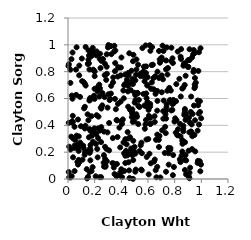
| Category | Series 0 |
|---|---|
| 0.9111496311391557 | 0.047 |
| 0.4300386188368164 | 0.173 |
| 0.11681385047252048 | 0.232 |
| 0.7985105165914542 | 0.428 |
| 0.7381791122740708 | 0.534 |
| 0.2700319630789535 | 0.093 |
| 0.3221652277435572 | 0.637 |
| 0.9387445722189655 | 0.929 |
| 0.1267107533791488 | 0.538 |
| 0.4287532225961268 | 0.779 |
| 0.6065511356872197 | 0.471 |
| 0.8351346793216523 | 0.747 |
| 0.5862582522591401 | 0.839 |
| 0.44732217881595854 | 0.35 |
| 0.4488559231616693 | 0.695 |
| 0.43003705787691354 | 0.297 |
| 0.7948076341762961 | 0.57 |
| 0.19928670790254213 | 0.672 |
| 0.8404600769013258 | 0.41 |
| 0.5054611740116359 | 0.586 |
| 0.3084729279485909 | 0.418 |
| 0.7179206851709915 | 0.585 |
| 0.5133860988383984 | 0.891 |
| 0.2487105842375922 | 0.013 |
| 0.9719962370362792 | 0.12 |
| 0.20007833114893941 | 0.767 |
| 0.5045101652680709 | 0.625 |
| 0.2913176435872602 | 0.133 |
| 0.2808524073220717 | 0.091 |
| 0.482868410909338 | 0.519 |
| 0.6689423891697657 | 0.509 |
| 0.9539236712242827 | 0.206 |
| 0.15937151676626518 | 0.917 |
| 0.9161528200462707 | 0.084 |
| 0.5359604944910391 | 0.537 |
| 0.16169019273082397 | 0.372 |
| 0.9360456858402164 | 0.33 |
| 0.21445749638043748 | 0.475 |
| 0.2226863188615661 | 0.652 |
| 0.7943998662306855 | 0.089 |
| 0.6576356980399197 | 0.066 |
| 0.4674079711340942 | 0.716 |
| 0.7402084669375346 | 0.557 |
| 0.5082239356295544 | 0.07 |
| 0.4420562838119133 | 0.739 |
| 0.27643736715558326 | 0.859 |
| 0.9926049077738904 | 0.058 |
| 0.5907746905910469 | 0.164 |
| 0.7868394595893657 | 0.865 |
| 0.3521998926847201 | 0.597 |
| 0.9303609166335965 | 0.223 |
| 0.23762078883065302 | 0.896 |
| 0.41155091159005164 | 0.06 |
| 0.6976025533912326 | 0.883 |
| 0.07478338903566999 | 0.443 |
| 0.08399607855279058 | 0.773 |
| 0.45103926048094395 | 0.539 |
| 0.4872870481964307 | 0.878 |
| 0.87690141673974 | 0.067 |
| 0.62309148330923 | 0.672 |
| 0.4894274524033153 | 0.285 |
| 0.8214296172695141 | 0.329 |
| 0.24027694764938207 | 0.933 |
| 0.04974177553686305 | 0.251 |
| 0.038212485345732704 | 0.162 |
| 0.8388338152152539 | 0.147 |
| 0.8698020250938937 | 0.86 |
| 0.5761020111148663 | 0.374 |
| 0.5542692115275305 | 0.192 |
| 0.21924962939992823 | 0.224 |
| 0.876567389653877 | 0.509 |
| 0.1176887937832676 | 0.722 |
| 0.752226267749434 | 0.192 |
| 0.07232337755618982 | 0.257 |
| 0.40321776138264415 | 0.431 |
| 0.5049398897146776 | 0.055 |
| 0.4758998143823204 | 0.51 |
| 0.740841750482692 | 0.981 |
| 0.059896144765139034 | 0.815 |
| 0.2401012145934733 | 0.675 |
| 0.026901871690102087 | 0.422 |
| 0.8786929570265387 | 0.863 |
| 0.3763799511567945 | 0.833 |
| 0.19520073622943923 | 0.621 |
| 0.7743492254205568 | 0.511 |
| 0.1631308451751773 | 0.195 |
| 0.9221726681360116 | 0.354 |
| 0.15909288980710912 | 0.921 |
| 0.4537360803392208 | 0.302 |
| 0.5712740880633747 | 0.838 |
| 0.005587227622727847 | 0.052 |
| 0.943444685102764 | 0.813 |
| 0.45970567612820423 | 0.937 |
| 0.7259544833258703 | 0.194 |
| 0.34624599378630816 | 0.95 |
| 0.9509715515077806 | 0.94 |
| 0.3493688597244169 | 0.037 |
| 0.4906103457569296 | 0.926 |
| 0.3730681676680422 | 0.763 |
| 0.48168743190293045 | 0.487 |
| 0.04883140608225112 | 0.389 |
| 0.6175114920485316 | 0.456 |
| 0.008760988786869347 | 0.241 |
| 0.9826457695010916 | 0.406 |
| 0.8123295826385284 | 0.707 |
| 0.8813455821406656 | 0.179 |
| 0.767051686571116 | 0.217 |
| 0.6187659586473282 | 0.41 |
| 0.4812705106600412 | 0.498 |
| 0.025836629642352293 | 0.893 |
| 0.941023196081663 | 0.799 |
| 0.5850044985746435 | 0.44 |
| 0.682341655697244 | 0.239 |
| 0.7825508791672247 | 0.515 |
| 0.9520491313763357 | 0.753 |
| 0.43481581343088727 | 0.209 |
| 0.023551771394068277 | 0.316 |
| 0.5130058153463005 | 0.816 |
| 0.26953783926164593 | 0.177 |
| 0.09730790284939007 | 0.393 |
| 0.663416247100233 | 0.013 |
| 0.22544022324458476 | 0.688 |
| 0.32504495027505376 | 0.93 |
| 0.19969644191872474 | 0.597 |
| 0.6857967307791488 | 0.321 |
| 0.7579993992574036 | 0.217 |
| 0.7288707246093039 | 0.389 |
| 0.9062664315511201 | 0.017 |
| 0.10367045433375191 | 0.898 |
| 0.22564465064415357 | 0.305 |
| 0.13240100288058423 | 0.984 |
| 0.671028275009286 | 0.8 |
| 0.15280136517436163 | 0.438 |
| 0.49265865009890286 | 0.202 |
| 0.39679976875938894 | 0.831 |
| 0.42828779709065523 | 0.708 |
| 0.4213157016411308 | 0.699 |
| 0.7680185431607683 | 0.23 |
| 0.9893255299276582 | 0.58 |
| 0.7900587321114094 | 0.589 |
| 0.7756833519142676 | 0.979 |
| 0.8458151306899847 | 0.615 |
| 0.3854031375389695 | 0.383 |
| 0.49882682942240414 | 0.24 |
| 0.6706159708335547 | 0.582 |
| 0.3914169937285117 | 0.047 |
| 0.9939247139479255 | 0.975 |
| 0.9340045036081808 | 0.485 |
| 0.07986537616585188 | 0.209 |
| 0.05449427400802917 | 0.292 |
| 0.39544665280635954 | 0.773 |
| 0.08032858588812802 | 0.142 |
| 0.034017297367350666 | 0.943 |
| 0.6161196408934705 | 0.54 |
| 0.1757225119408164 | 0.468 |
| 0.5257227155728047 | 0.852 |
| 0.703084193369922 | 0.646 |
| 0.07919287777658164 | 0.239 |
| 0.8744259201408906 | 0.49 |
| 0.8248153629797152 | 0.371 |
| 0.01917307968669447 | 0.012 |
| 0.6455770824102766 | 0.13 |
| 0.2753713638042745 | 0.774 |
| 0.5052301861827468 | 0.735 |
| 0.7837023749152509 | 0.9 |
| 0.018765271043172115 | 0.22 |
| 0.17653834796077228 | 0.059 |
| 0.7851836252765338 | 0.557 |
| 0.06438279124625247 | 0.982 |
| 0.8775693251550845 | 0.274 |
| 0.4494715765987105 | 0.653 |
| 0.621012419698169 | 0.117 |
| 0.859439359352633 | 0.282 |
| 0.33911390747775305 | 0.757 |
| 0.3588237063014709 | 0.52 |
| 0.8100756523471898 | 0.58 |
| 0.3640979837635689 | 0.021 |
| 0.24929612866749917 | 0.387 |
| 0.9898989873816444 | 0.499 |
| 0.41815318400173646 | 0.601 |
| 0.09179441449348216 | 0.271 |
| 0.8862998370651437 | 0.139 |
| 0.006274618011588827 | 0.856 |
| 0.9003076634861106 | 0.834 |
| 0.4507449248947203 | 0.79 |
| 0.6411268964553156 | 0.752 |
| 0.2224737885086305 | 0.161 |
| 0.7866470594573786 | 0.029 |
| 0.8487515444871679 | 0.968 |
| 0.5271780323742159 | 0.545 |
| 0.5052193867373331 | 0.189 |
| 0.06397933855268545 | 0.323 |
| 0.16632330492320033 | 0.59 |
| 0.08452118674544683 | 0.124 |
| 0.26226640652464206 | 0.894 |
| 0.0847946098456753 | 0.845 |
| 0.15685260605337195 | 0.311 |
| 0.22864330152590254 | 0.465 |
| 0.5447199334130336 | 0.767 |
| 0.8721031026799437 | 0.478 |
| 0.3163480790695066 | 0.596 |
| 0.18100616759296553 | 0.323 |
| 0.8813875304684765 | 0.44 |
| 0.59560499671388 | 0.538 |
| 0.21180969954778517 | 0.334 |
| 0.11378361409356955 | 0.249 |
| 0.48763989077746944 | 0.001 |
| 0.04029030924734762 | 0.3 |
| 0.9483932315101667 | 0.677 |
| 0.2383875103758074 | 0.36 |
| 0.0177769035114162 | 0.815 |
| 0.24978517041126838 | 0.525 |
| 0.9734767486221393 | 0.585 |
| 0.5742748563771243 | 0.728 |
| 0.6493970929622763 | 0.468 |
| 0.8646022898844322 | 0.397 |
| 0.14377879817939881 | 0.004 |
| 0.6052241117624018 | 0.034 |
| 0.30367961988089104 | 0.632 |
| 0.7597245571204744 | 0.679 |
| 0.02880479635935147 | 0.622 |
| 0.9274333788455694 | 0.407 |
| 0.49748544975427494 | 0.43 |
| 0.9104304492959125 | 0.006 |
| 0.12480412435384455 | 0.181 |
| 0.884345972348518 | 0.485 |
| 0.7888246886596952 | 0.178 |
| 0.05010787103246642 | 0.231 |
| 0.16764279642788887 | 0.139 |
| 0.6820139419356843 | 0.753 |
| 0.2919633290471828 | 0.784 |
| 0.09026721276470592 | 0.612 |
| 0.1623759204625662 | 0.052 |
| 0.6696282502788881 | 0.331 |
| 0.1872550322702444 | 0.278 |
| 0.7313012747173697 | 0.483 |
| 0.10581246622910304 | 0.729 |
| 0.7028842753028343 | 0.772 |
| 0.8755665192235897 | 0.701 |
| 0.5953209145495835 | 0.7 |
| 0.5813713028113396 | 0.546 |
| 0.9124424929485175 | 0.422 |
| 0.2455905148012621 | 0.533 |
| 0.12857854477047578 | 0.201 |
| 0.16469421912044294 | 0.227 |
| 0.34413890772122013 | 0.114 |
| 0.13245981401363427 | 0.697 |
| 0.16893580289818075 | 0.254 |
| 0.3847318346268138 | 0.029 |
| 0.005399768778397544 | 0.419 |
| 0.5952114951543013 | 0.697 |
| 0.20963372149151546 | 0.262 |
| 0.6692693612619083 | 0.09 |
| 0.15602012778356075 | 0.862 |
| 0.4701671348628871 | 0.662 |
| 0.19598799089965352 | 0.805 |
| 0.7647363527612803 | 0.58 |
| 0.21465359330388317 | 0.951 |
| 0.8445243386020784 | 0.912 |
| 0.6540157586665576 | 0.765 |
| 0.5629011547370278 | 0.798 |
| 0.6687288286755981 | 0.657 |
| 0.5101854614631756 | 0.776 |
| 0.9722113911167326 | 0.36 |
| 0.12046569035783182 | 0.527 |
| 0.4544942237458471 | 0.125 |
| 0.8435110820322342 | 0.318 |
| 0.8853584648805858 | 0.035 |
| 0.6825224080144272 | 0.954 |
| 0.8587929087278529 | 0.262 |
| 0.5579309056935479 | 0.976 |
| 0.45843683942843644 | 0.064 |
| 0.4548262540265198 | 0.703 |
| 0.4225252467339125 | 0.06 |
| 0.7749881198674418 | 0.878 |
| 0.24793985172870386 | 0.275 |
| 0.8522300430809937 | 0.175 |
| 0.9481681768329914 | 0.328 |
| 0.23520353394011623 | 0.614 |
| 0.4655884353475929 | 0.311 |
| 0.28775112618688087 | 0.225 |
| 0.15394479250881912 | 0.865 |
| 0.4698374076950021 | 0.512 |
| 0.8656013902200975 | 0.844 |
| 0.48608809437462175 | 0.426 |
| 0.27813953340355224 | 0.15 |
| 0.6564192551374263 | 0.635 |
| 0.9211280781796216 | 0.5 |
| 0.7351113801966238 | 0.054 |
| 0.18565973627333884 | 0.977 |
| 0.03576656743174452 | 0.471 |
| 0.7140524831238316 | 0.505 |
| 0.7123563891438197 | 0.743 |
| 0.3915835078948125 | 0.236 |
| 0.572785436185337 | 0.547 |
| 0.4991576149935779 | 0.643 |
| 0.41501338504348406 | 0.66 |
| 0.2573104878836541 | 0.549 |
| 0.975497208738205 | 0.55 |
| 0.07505048824209203 | 0.108 |
| 0.5724429234536887 | 0.763 |
| 0.7357865615727973 | 0.51 |
| 0.9246928957282298 | 0.35 |
| 0.25076474672907956 | 0.88 |
| 0.032419043037878584 | 0.43 |
| 0.48187682899384565 | 0.177 |
| 0.6598951664406528 | 0.292 |
| 0.48445849479543235 | 0.746 |
| 0.5893083750348156 | 0.603 |
| 0.3474435439066111 | 0.993 |
| 0.5532272836003694 | 0.065 |
| 0.5316097543098819 | 0.589 |
| 0.8039051164061431 | 0.452 |
| 0.3689651995443692 | 0.437 |
| 0.9101439839449574 | 0.348 |
| 0.4648392637384652 | 0.519 |
| 0.9044739395691748 | 0.211 |
| 0.270061186596074 | 0.354 |
| 0.8229408695928077 | 0.95 |
| 0.15349554410771482 | 0.89 |
| 0.14390503567648563 | 0.205 |
| 0.5488966629912435 | 0.07 |
| 0.24383046416597406 | 0.827 |
| 0.6040563112554095 | 0.515 |
| 0.6508364079686448 | 0.145 |
| 0.43982219121103644 | 0.258 |
| 0.04966310262180306 | 0.059 |
| 0.27410290187233943 | 0.611 |
| 0.5957477171589858 | 0.575 |
| 0.7446870081474366 | 0.658 |
| 0.9983281113827457 | 0.452 |
| 0.3222462187789793 | 0.99 |
| 0.0033294293011412778 | 0.843 |
| 0.714910455477086 | 0.45 |
| 0.1504093353605 | 0.016 |
| 0.355367555169529 | 0.958 |
| 0.13064787056418273 | 0.397 |
| 0.586735983353006 | 0.638 |
| 0.9113158379588734 | 0.967 |
| 0.26709244730732074 | 0.121 |
| 0.18480579621523677 | 0.089 |
| 0.44756895475378894 | 0.177 |
| 0.22630834394715654 | 0.377 |
| 0.4786280226514887 | 0.462 |
| 0.018032482971785987 | 0.716 |
| 0.33787486038635967 | 0.72 |
| 0.7060697262550751 | 0.363 |
| 0.16037502131211015 | 0.585 |
| 0.1923264879729971 | 0.945 |
| 0.20038170153305127 | 0.802 |
| 0.4867522747781392 | 0.707 |
| 0.4627241420024789 | 0.205 |
| 0.6306259271255792 | 0.983 |
| 0.1949009456227638 | 0.352 |
| 0.8821936961119609 | 0.769 |
| 0.6286506862018308 | 0.72 |
| 0.16090512224983794 | 0.816 |
| 0.286681341287852 | 0.739 |
| 0.6929347292016164 | 0.011 |
| 0.5180430629211012 | 0.464 |
| 0.9011662287840501 | 0.886 |
| 0.6426821930166791 | 0.669 |
| 0.12599641981854187 | 0.71 |
| 0.15379470399089712 | 0.958 |
| 0.5131117712463316 | 0.482 |
| 0.37465390498260465 | 0.56 |
| 0.14054283456926503 | 0.073 |
| 0.3998931467720705 | 0.073 |
| 0.1747782563213394 | 0.915 |
| 0.5977507389358183 | 0.758 |
| 0.734986426945574 | 0.817 |
| 0.876745084083697 | 0.522 |
| 0.4007449070588922 | 0.906 |
| 0.3716029877899251 | 0.313 |
| 0.979700926223514 | 0.488 |
| 0.8573316412036209 | 0.205 |
| 0.5370454399235391 | 0.208 |
| 0.45394097062533695 | 0.773 |
| 0.4738967054804393 | 0.227 |
| 0.23859358491156196 | 0.014 |
| 0.8639068707135346 | 0.681 |
| 0.8138201034404088 | 0.438 |
| 0.8436807504478155 | 0.126 |
| 0.3086932218356539 | 0.213 |
| 0.6131225369540642 | 0.997 |
| 0.7023348105295489 | 0.905 |
| 0.912454120501298 | 0.887 |
| 0.8570375728392539 | 0.674 |
| 0.8758664059772147 | 0.142 |
| 0.9774553042929551 | 0.805 |
| 0.7495743740632987 | 0.827 |
| 0.865034942735361 | 0.355 |
| 0.9537264373692955 | 0.689 |
| 0.7649956621461231 | 0.589 |
| 0.4916979604443851 | 0.468 |
| 0.6811073396132334 | 0.292 |
| 0.7356691292229984 | 0.45 |
| 0.03608270852264394 | 0.424 |
| 0.4048173906136502 | 0.015 |
| 0.47625937239212457 | 0.807 |
| 0.8578062022665671 | 0.289 |
| 0.8641530248449524 | 0.376 |
| 0.35236441754230796 | 0.804 |
| 0.6268535857692868 | 0.849 |
| 0.581175300786519 | 0.407 |
| 0.9448143718635422 | 0.548 |
| 0.2108953290103585 | 0.922 |
| 0.565785592942319 | 0.634 |
| 0.5849654443828796 | 0.79 |
| 0.4615039704124394 | 0.007 |
| 0.36677247139202795 | 0.112 |
| 0.32377214863305087 | 0.694 |
| 0.08092078372941008 | 0.318 |
| 0.5883249531337096 | 0.294 |
| 0.6895874910183369 | 0.867 |
| 0.5822880898928268 | 0.996 |
| 0.7529530551330442 | 0.232 |
| 0.9819272418329588 | 0.945 |
| 0.7712583499485448 | 0.659 |
| 0.4112804175875829 | 0.444 |
| 0.6507112167378887 | 0.425 |
| 0.02773641730181459 | 0.021 |
| 0.4889993871082694 | 0.141 |
| 0.616515796493571 | 0.559 |
| 0.2816249259111997 | 0.1 |
| 0.07026422702909252 | 0.127 |
| 0.16540839098030533 | 0.603 |
| 0.27766720511748205 | 0.24 |
| 0.9084023697782886 | 0.458 |
| 0.36425357014219817 | 0.44 |
| 0.9887054825920689 | 0.132 |
| 0.19769424575131037 | 0.377 |
| 0.3539325358590926 | 0.864 |
| 0.49282572233518024 | 0.212 |
| 0.7462167347315874 | 0.779 |
| 0.8082859310869005 | 0.345 |
| 0.14881359960106247 | 0.857 |
| 0.571274038467833 | 0.836 |
| 0.3335441129398718 | 0.119 |
| 0.3032125015384867 | 0.998 |
| 0.9974006501978054 | 0.107 |
| 0.18363430742967424 | 0.345 |
| 0.6176356915933481 | 0.955 |
| 0.2999215312792809 | 0.98 |
| 0.10887054275662905 | 0.144 |
| 0.38165933351763137 | 0.83 |
| 0.7092600676442516 | 0.994 |
| 0.430110738788333 | 0.119 |
| 0.29011660446067017 | 0.837 |
| 0.1260001690078417 | 0.376 |
| 0.14687657300835286 | 0.482 |
| 0.6109946080754031 | 0.188 |
| 0.009034837817281044 | 0.013 |
| 0.34373836311232236 | 0.086 |
| 0.9502455906374477 | 0.705 |
| 0.1691984412351196 | 0.214 |
| 0.6365603997770843 | 0.852 |
| 0.5269345380389276 | 0.409 |
| 0.3118973734018932 | 0.588 |
| 0.45232580642432385 | 0.78 |
| 0.7356727406360125 | 0.883 |
| 0.5239049143967517 | 0.638 |
| 0.542178785271175 | 0.783 |
| 0.5452089677619399 | 0.251 |
| 0.9746741142741795 | 0.135 |
| 0.500437027124027 | 0.569 |
| 0.9432825372587047 | 0.961 |
| 0.6158344282874106 | 0.412 |
| 0.6877340967406099 | 0.891 |
| 0.4162611949304369 | 0.272 |
| 0.3362864449615718 | 0.305 |
| 0.821634621671969 | 0.326 |
| 0.9525099290649873 | 0.438 |
| 0.8475672588649977 | 0.895 |
| 0.4209476841480431 | 0.192 |
| 0.9322516620923039 | 0.319 |
| 0.18954060682584475 | 0.815 |
| 0.7011662063030352 | 0.892 |
| 0.29689272868560607 | 0.532 |
| 0.755176393331784 | 0.107 |
| 0.20757743310728957 | 0.02 |
| 0.39520521439462836 | 0.577 |
| 0.17468199107881754 | 0.956 |
| 0.5507354822957218 | 0.271 |
| 0.7159330929798108 | 0.954 |
| 0.29037195378984204 | 0.929 |
| 0.9027061506913044 | 0.836 |
| 0.9587436592719039 | 0.718 |
| 0.5193878205955742 | 0.642 |
| 0.033479371856075545 | 0.598 |
| 0.25877538031532676 | 0.64 |
| 0.23465738655797183 | 0.704 |
| 0.9237049672002811 | 0.614 |
| 0.6020632505800014 | 0.298 |
| 0.06118012542209493 | 0.627 |
| 0.16812172353839547 | 0.36 |
| 0.7332315030795299 | 0.342 |
| 0.29604081934181636 | 0.348 |
| 0.9306601800497131 | 0.907 |
| 0.4047633806187904 | 0.411 |